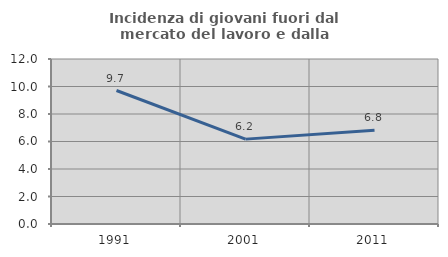
| Category | Incidenza di giovani fuori dal mercato del lavoro e dalla formazione  |
|---|---|
| 1991.0 | 9.709 |
| 2001.0 | 6.173 |
| 2011.0 | 6.818 |